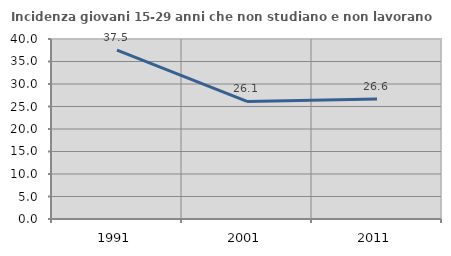
| Category | Incidenza giovani 15-29 anni che non studiano e non lavorano  |
|---|---|
| 1991.0 | 37.519 |
| 2001.0 | 26.124 |
| 2011.0 | 26.642 |